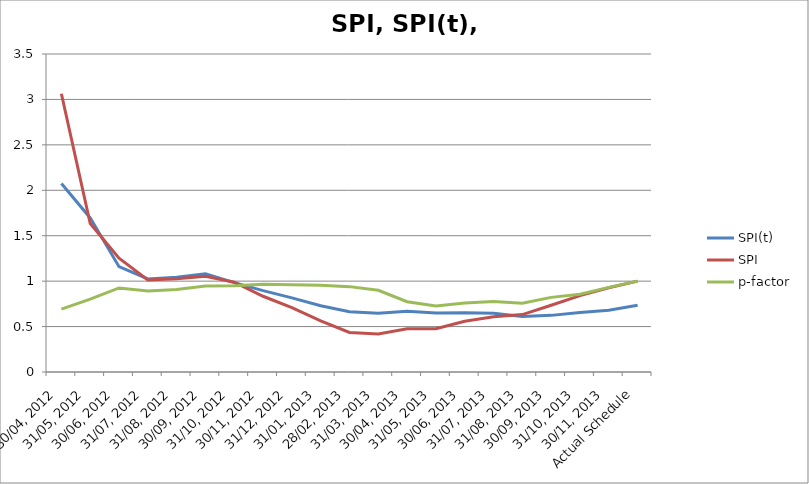
| Category | SPI(t) | SPI | p-factor |
|---|---|---|---|
| 30/04, 2012 | 2.075 | 3.062 | 0.691 |
| 31/05, 2012 | 1.696 | 1.634 | 0.801 |
| 30/06, 2012 | 1.16 | 1.252 | 0.925 |
| 31/07, 2012 | 1.024 | 1.012 | 0.891 |
| 31/08, 2012 | 1.043 | 1.026 | 0.909 |
| 30/09, 2012 | 1.082 | 1.054 | 0.946 |
| 31/10, 2012 | 0.984 | 0.989 | 0.949 |
| 30/11, 2012 | 0.895 | 0.834 | 0.966 |
| 31/12, 2012 | 0.816 | 0.709 | 0.959 |
| 31/01, 2013 | 0.729 | 0.564 | 0.956 |
| 28/02, 2013 | 0.664 | 0.435 | 0.94 |
| 31/03, 2013 | 0.648 | 0.42 | 0.899 |
| 30/04, 2013 | 0.668 | 0.477 | 0.773 |
| 31/05, 2013 | 0.648 | 0.476 | 0.725 |
| 30/06, 2013 | 0.652 | 0.558 | 0.759 |
| 31/07, 2013 | 0.646 | 0.608 | 0.775 |
| 31/08, 2013 | 0.612 | 0.632 | 0.757 |
| 30/09, 2013 | 0.623 | 0.735 | 0.821 |
| 31/10, 2013 | 0.656 | 0.84 | 0.856 |
| 30/11, 2013 | 0.679 | 0.927 | 0.931 |
| Actual Schedule | 0.734 | 1 | 1 |